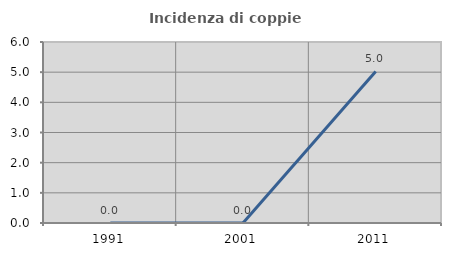
| Category | Incidenza di coppie miste |
|---|---|
| 1991.0 | 0 |
| 2001.0 | 0 |
| 2011.0 | 5.025 |